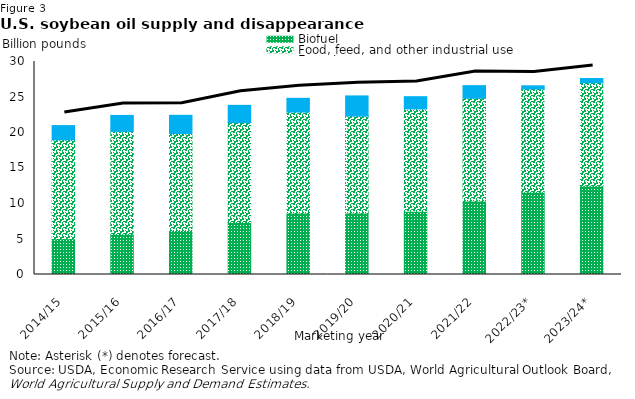
| Category | Biofuel | Food, feed, and other industrial use | Exports |
|---|---|---|---|
| 2014/15 | 5.039 | 13.92 | 2.014 |
| 2015/16 | 5.67 | 14.492 | 2.243 |
| 2016/17 | 6.2 | 13.662 | 2.556 |
| 2017/18 | 7.334 | 14.047 | 2.443 |
| 2018/19 | 8.663 | 14.211 | 1.94 |
| 2019/20 | 8.658 | 13.659 | 2.837 |
| 2020/21 | 8.92 | 14.394 | 1.731 |
| 2021/22 | 10.348 | 14.477 | 1.773 |
| 2022/23* | 11.6 | 14.525 | 0.45 |
| 2023/24* | 12.5 | 14.5 | 0.6 |